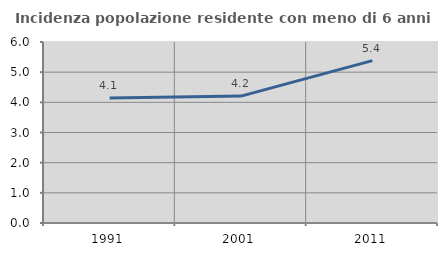
| Category | Incidenza popolazione residente con meno di 6 anni |
|---|---|
| 1991.0 | 4.145 |
| 2001.0 | 4.207 |
| 2011.0 | 5.381 |